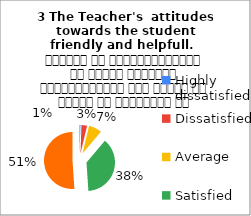
| Category | 3 The Teacher's  attitudes towards the student friendly and helpfull.   शिक्षक का विद्यार्थियों के प्रति व्यवहार मित्रतापूर्ण एवम सहयोग के भावना से परिपूर्ण था |
|---|---|
| Highly dissatisfied | 1 |
| Dissatisfied | 6 |
| Average | 14 |
| Satisfied | 71 |
| Highly satisfied | 96 |